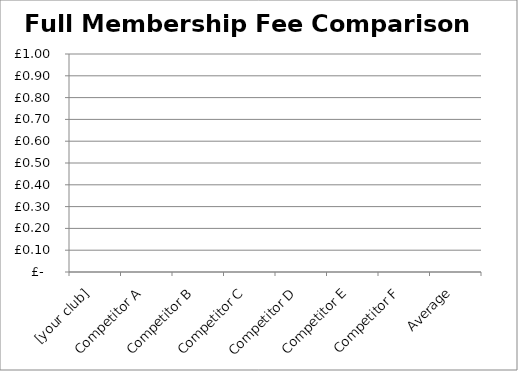
| Category | Full Membership Fee |
|---|---|
| [your club] | 0 |
| Competitor A | 0 |
| Competitor B | 0 |
| Competitor C | 0 |
| Competitor D | 0 |
| Competitor E | 0 |
| Competitor F | 0 |
| Average | 0 |